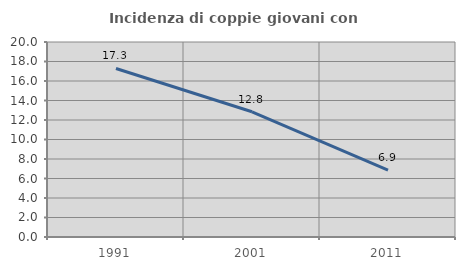
| Category | Incidenza di coppie giovani con figli |
|---|---|
| 1991.0 | 17.287 |
| 2001.0 | 12.844 |
| 2011.0 | 6.863 |